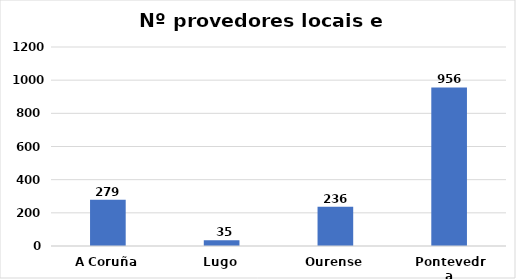
| Category | Series 0 |
|---|---|
| A Coruña | 279 |
| Lugo | 35 |
| Ourense | 236 |
| Pontevedra | 956 |